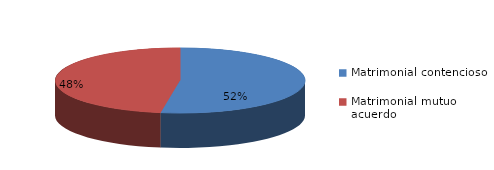
| Category | Series 0 |
|---|---|
| 0 | 6509 |
| 1 | 5900 |